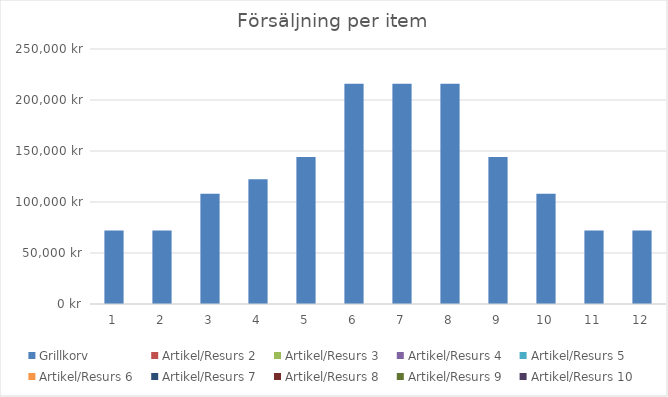
| Category | Grillkorv | Artikel/Resurs 2 | Artikel/Resurs 3 | Artikel/Resurs 4 | Artikel/Resurs 5 | Artikel/Resurs 6 | Artikel/Resurs 7 | Artikel/Resurs 8 | Artikel/Resurs 9 | Artikel/Resurs 10 |
|---|---|---|---|---|---|---|---|---|---|---|
| 0 | 72000 | 0 | 0 | 0 | 0 | 0 | 0 | 0 | 0 | 0 |
| 1 | 72000 | 0 | 0 | 0 | 0 | 0 | 0 | 0 | 0 | 0 |
| 2 | 108000 | 0 | 0 | 0 | 0 | 0 | 0 | 0 | 0 | 0 |
| 3 | 122400 | 0 | 0 | 0 | 0 | 0 | 0 | 0 | 0 | 0 |
| 4 | 144000 | 0 | 0 | 0 | 0 | 0 | 0 | 0 | 0 | 0 |
| 5 | 216000 | 0 | 0 | 0 | 0 | 0 | 0 | 0 | 0 | 0 |
| 6 | 216000 | 0 | 0 | 0 | 0 | 0 | 0 | 0 | 0 | 0 |
| 7 | 216000 | 0 | 0 | 0 | 0 | 0 | 0 | 0 | 0 | 0 |
| 8 | 144000 | 0 | 0 | 0 | 0 | 0 | 0 | 0 | 0 | 0 |
| 9 | 108000 | 0 | 0 | 0 | 0 | 0 | 0 | 0 | 0 | 0 |
| 10 | 72000 | 0 | 0 | 0 | 0 | 0 | 0 | 0 | 0 | 0 |
| 11 | 72000 | 0 | 0 | 0 | 0 | 0 | 0 | 0 | 0 | 0 |